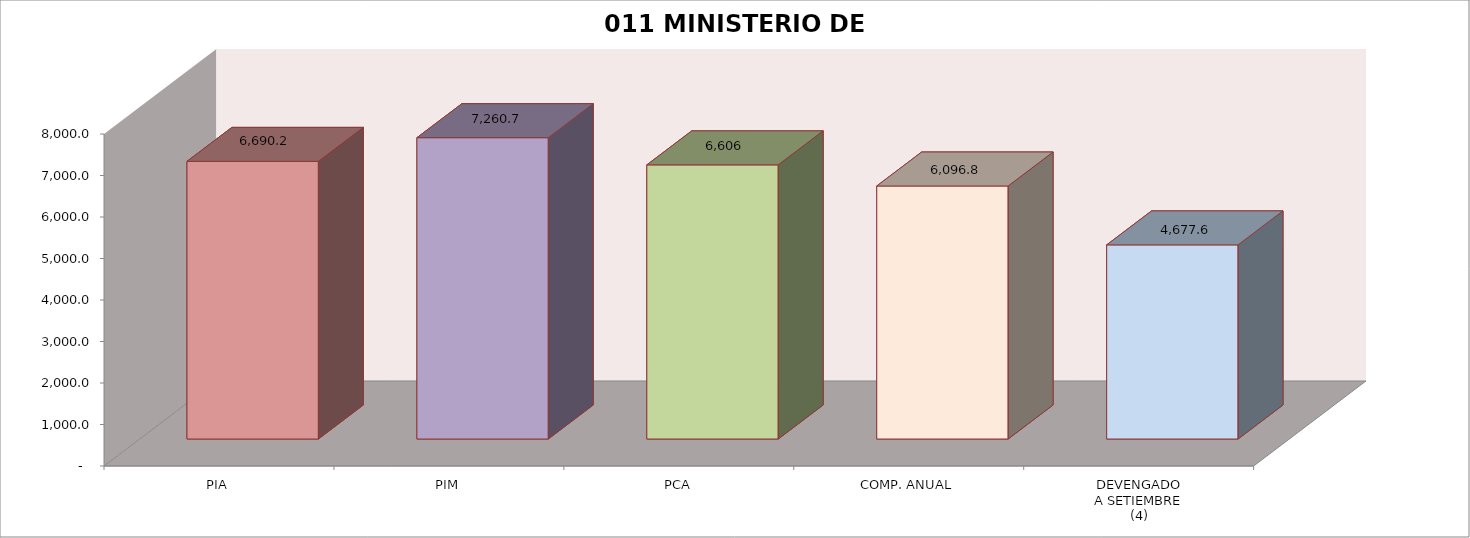
| Category | 011 MINISTERIO DE SALUD |
|---|---|
| PIA | 6690.187 |
| PIM | 7260.712 |
| PCA | 6605.744 |
| COMP. ANUAL | 6096.849 |
| DEVENGADO
A SETIEMBRE
(4) | 4677.627 |